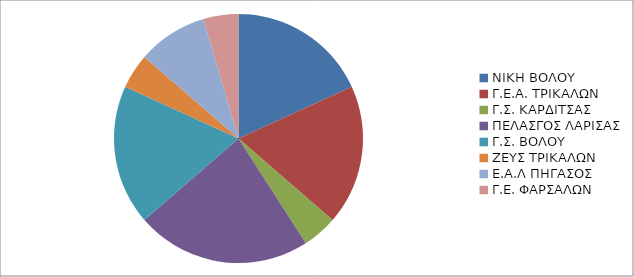
| Category | Series 0 |
|---|---|
| ΝΙΚΗ ΒΟΛΟΥ | 4 |
| Γ.Ε.Α. ΤΡΙΚΑΛΩΝ | 4 |
| Γ.Σ. ΚΑΡΔΙΤΣΑΣ | 1 |
| ΠΕΛΑΣΓΟΣ ΛΑΡΙΣΑΣ | 5 |
| Γ.Σ. ΒΟΛΟΥ | 4 |
| ΖΕΥΣ ΤΡΙΚΑΛΩΝ | 1 |
| Ε.Α.Λ ΠΗΓΑΣΟΣ  | 2 |
| Γ.Ε. ΦΑΡΣΑΛΩΝ | 1 |